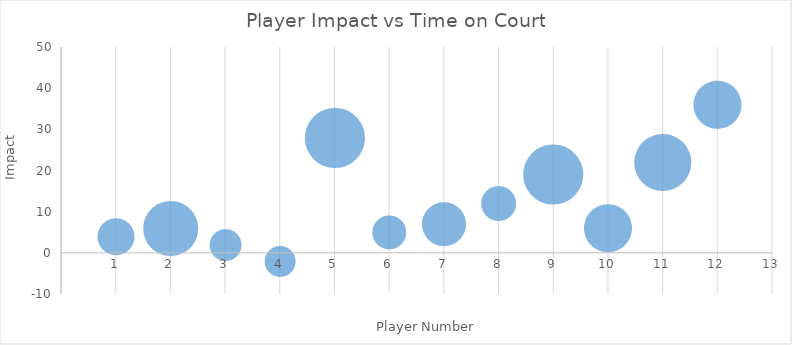
| Category | Series 0 |
|---|---|
| 0 | 4 |
| 1 | 6 |
| 2 | 2 |
| 3 | -2 |
| 4 | 28 |
| 5 | 5 |
| 6 | 7 |
| 7 | 12 |
| 8 | 19 |
| 9 | 6 |
| 10 | 22 |
| 11 | 36 |